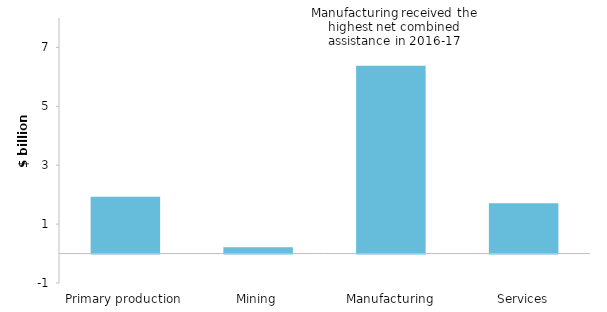
| Category | Net combined assistance |
|---|---|
| Primary production | 1.931 |
| Mining | 0.214 |
| Manufacturing | 6.379 |
| Services | 1.71 |